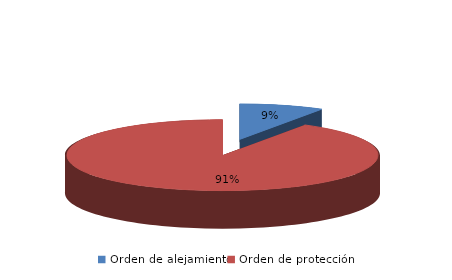
| Category | Series 0 |
|---|---|
| Orden de alejamiento | 28 |
| Orden de protección | 293 |